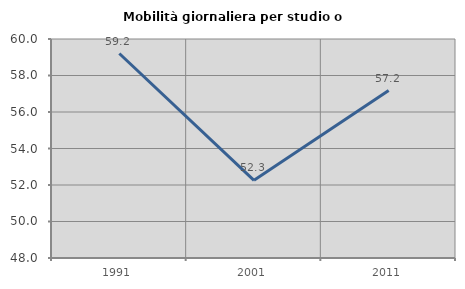
| Category | Mobilità giornaliera per studio o lavoro |
|---|---|
| 1991.0 | 59.205 |
| 2001.0 | 52.257 |
| 2011.0 | 57.176 |